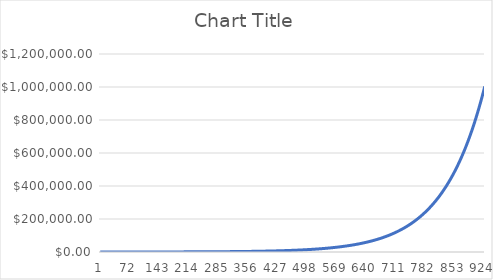
| Category | Series 0 |
|---|---|
| 0 | 101 |
| 1 | 102.01 |
| 2 | 103.03 |
| 3 | 104.06 |
| 4 | 105.101 |
| 5 | 106.152 |
| 6 | 107.214 |
| 7 | 108.286 |
| 8 | 109.369 |
| 9 | 110.462 |
| 10 | 111.567 |
| 11 | 112.683 |
| 12 | 113.809 |
| 13 | 114.947 |
| 14 | 116.097 |
| 15 | 117.258 |
| 16 | 118.43 |
| 17 | 119.615 |
| 18 | 120.811 |
| 19 | 122.019 |
| 20 | 123.239 |
| 21 | 124.472 |
| 22 | 125.716 |
| 23 | 126.973 |
| 24 | 128.243 |
| 25 | 129.526 |
| 26 | 130.821 |
| 27 | 132.129 |
| 28 | 133.45 |
| 29 | 134.785 |
| 30 | 136.133 |
| 31 | 137.494 |
| 32 | 138.869 |
| 33 | 140.258 |
| 34 | 141.66 |
| 35 | 143.077 |
| 36 | 144.508 |
| 37 | 145.953 |
| 38 | 147.412 |
| 39 | 148.886 |
| 40 | 150.375 |
| 41 | 151.879 |
| 42 | 153.398 |
| 43 | 154.932 |
| 44 | 156.481 |
| 45 | 158.046 |
| 46 | 159.626 |
| 47 | 161.223 |
| 48 | 162.835 |
| 49 | 164.463 |
| 50 | 166.108 |
| 51 | 167.769 |
| 52 | 169.447 |
| 53 | 171.141 |
| 54 | 172.852 |
| 55 | 174.581 |
| 56 | 176.327 |
| 57 | 178.09 |
| 58 | 179.871 |
| 59 | 181.67 |
| 60 | 183.486 |
| 61 | 185.321 |
| 62 | 187.174 |
| 63 | 189.046 |
| 64 | 190.937 |
| 65 | 192.846 |
| 66 | 194.774 |
| 67 | 196.722 |
| 68 | 198.689 |
| 69 | 200.676 |
| 70 | 202.683 |
| 71 | 204.71 |
| 72 | 206.757 |
| 73 | 208.825 |
| 74 | 210.913 |
| 75 | 213.022 |
| 76 | 215.152 |
| 77 | 217.304 |
| 78 | 219.477 |
| 79 | 221.672 |
| 80 | 223.888 |
| 81 | 226.127 |
| 82 | 228.388 |
| 83 | 230.672 |
| 84 | 232.979 |
| 85 | 235.309 |
| 86 | 237.662 |
| 87 | 240.038 |
| 88 | 242.439 |
| 89 | 244.863 |
| 90 | 247.312 |
| 91 | 249.785 |
| 92 | 252.283 |
| 93 | 254.806 |
| 94 | 257.354 |
| 95 | 259.927 |
| 96 | 262.527 |
| 97 | 265.152 |
| 98 | 267.803 |
| 99 | 270.481 |
| 100 | 273.186 |
| 101 | 275.918 |
| 102 | 278.677 |
| 103 | 281.464 |
| 104 | 284.279 |
| 105 | 287.121 |
| 106 | 289.993 |
| 107 | 292.893 |
| 108 | 295.822 |
| 109 | 298.78 |
| 110 | 301.768 |
| 111 | 304.785 |
| 112 | 307.833 |
| 113 | 310.911 |
| 114 | 314.02 |
| 115 | 317.161 |
| 116 | 320.332 |
| 117 | 323.536 |
| 118 | 326.771 |
| 119 | 330.039 |
| 120 | 333.339 |
| 121 | 336.672 |
| 122 | 340.039 |
| 123 | 343.44 |
| 124 | 346.874 |
| 125 | 350.343 |
| 126 | 353.846 |
| 127 | 357.385 |
| 128 | 360.958 |
| 129 | 364.568 |
| 130 | 368.214 |
| 131 | 371.896 |
| 132 | 375.615 |
| 133 | 379.371 |
| 134 | 383.165 |
| 135 | 386.996 |
| 136 | 390.866 |
| 137 | 394.775 |
| 138 | 398.723 |
| 139 | 402.71 |
| 140 | 406.737 |
| 141 | 410.804 |
| 142 | 414.912 |
| 143 | 419.062 |
| 144 | 423.252 |
| 145 | 427.485 |
| 146 | 431.76 |
| 147 | 436.077 |
| 148 | 440.438 |
| 149 | 444.842 |
| 150 | 449.291 |
| 151 | 453.784 |
| 152 | 458.321 |
| 153 | 462.905 |
| 154 | 467.534 |
| 155 | 472.209 |
| 156 | 476.931 |
| 157 | 481.7 |
| 158 | 486.517 |
| 159 | 491.383 |
| 160 | 496.296 |
| 161 | 501.259 |
| 162 | 506.272 |
| 163 | 511.335 |
| 164 | 516.448 |
| 165 | 521.613 |
| 166 | 526.829 |
| 167 | 532.097 |
| 168 | 537.418 |
| 169 | 542.792 |
| 170 | 548.22 |
| 171 | 553.702 |
| 172 | 559.239 |
| 173 | 564.832 |
| 174 | 570.48 |
| 175 | 576.185 |
| 176 | 581.947 |
| 177 | 587.766 |
| 178 | 593.644 |
| 179 | 599.58 |
| 180 | 605.576 |
| 181 | 611.632 |
| 182 | 617.748 |
| 183 | 623.926 |
| 184 | 630.165 |
| 185 | 636.466 |
| 186 | 642.831 |
| 187 | 649.259 |
| 188 | 655.752 |
| 189 | 662.31 |
| 190 | 668.933 |
| 191 | 675.622 |
| 192 | 682.378 |
| 193 | 689.202 |
| 194 | 696.094 |
| 195 | 703.055 |
| 196 | 710.085 |
| 197 | 717.186 |
| 198 | 724.358 |
| 199 | 731.602 |
| 200 | 738.918 |
| 201 | 746.307 |
| 202 | 753.77 |
| 203 | 761.308 |
| 204 | 768.921 |
| 205 | 776.61 |
| 206 | 784.376 |
| 207 | 792.22 |
| 208 | 800.142 |
| 209 | 808.144 |
| 210 | 816.225 |
| 211 | 824.387 |
| 212 | 832.631 |
| 213 | 840.957 |
| 214 | 849.367 |
| 215 | 857.861 |
| 216 | 866.439 |
| 217 | 875.104 |
| 218 | 883.855 |
| 219 | 892.693 |
| 220 | 901.62 |
| 221 | 910.636 |
| 222 | 919.743 |
| 223 | 928.94 |
| 224 | 938.23 |
| 225 | 947.612 |
| 226 | 957.088 |
| 227 | 966.659 |
| 228 | 976.325 |
| 229 | 986.089 |
| 230 | 995.95 |
| 231 | 1005.909 |
| 232 | 1015.968 |
| 233 | 1026.128 |
| 234 | 1036.389 |
| 235 | 1046.753 |
| 236 | 1057.221 |
| 237 | 1067.793 |
| 238 | 1078.471 |
| 239 | 1089.255 |
| 240 | 1100.148 |
| 241 | 1111.149 |
| 242 | 1122.261 |
| 243 | 1133.484 |
| 244 | 1144.818 |
| 245 | 1156.267 |
| 246 | 1167.829 |
| 247 | 1179.507 |
| 248 | 1191.303 |
| 249 | 1203.216 |
| 250 | 1215.248 |
| 251 | 1227.4 |
| 252 | 1239.674 |
| 253 | 1252.071 |
| 254 | 1264.592 |
| 255 | 1277.238 |
| 256 | 1290.01 |
| 257 | 1302.91 |
| 258 | 1315.939 |
| 259 | 1329.099 |
| 260 | 1342.39 |
| 261 | 1355.813 |
| 262 | 1369.372 |
| 263 | 1383.065 |
| 264 | 1396.896 |
| 265 | 1410.865 |
| 266 | 1424.974 |
| 267 | 1439.223 |
| 268 | 1453.616 |
| 269 | 1468.152 |
| 270 | 1482.833 |
| 271 | 1497.662 |
| 272 | 1512.638 |
| 273 | 1527.765 |
| 274 | 1543.042 |
| 275 | 1558.473 |
| 276 | 1574.057 |
| 277 | 1589.798 |
| 278 | 1605.696 |
| 279 | 1621.753 |
| 280 | 1637.97 |
| 281 | 1654.35 |
| 282 | 1670.894 |
| 283 | 1687.602 |
| 284 | 1704.479 |
| 285 | 1721.523 |
| 286 | 1738.739 |
| 287 | 1756.126 |
| 288 | 1773.687 |
| 289 | 1791.424 |
| 290 | 1809.338 |
| 291 | 1827.432 |
| 292 | 1845.706 |
| 293 | 1864.163 |
| 294 | 1882.805 |
| 295 | 1901.633 |
| 296 | 1920.649 |
| 297 | 1939.856 |
| 298 | 1959.254 |
| 299 | 1978.847 |
| 300 | 1998.635 |
| 301 | 2018.621 |
| 302 | 2038.808 |
| 303 | 2059.196 |
| 304 | 2079.788 |
| 305 | 2100.586 |
| 306 | 2121.591 |
| 307 | 2142.807 |
| 308 | 2164.235 |
| 309 | 2185.878 |
| 310 | 2207.737 |
| 311 | 2229.814 |
| 312 | 2252.112 |
| 313 | 2274.633 |
| 314 | 2297.38 |
| 315 | 2320.353 |
| 316 | 2343.557 |
| 317 | 2366.992 |
| 318 | 2390.662 |
| 319 | 2414.569 |
| 320 | 2438.715 |
| 321 | 2463.102 |
| 322 | 2487.733 |
| 323 | 2512.61 |
| 324 | 2537.736 |
| 325 | 2563.114 |
| 326 | 2588.745 |
| 327 | 2614.632 |
| 328 | 2640.778 |
| 329 | 2667.186 |
| 330 | 2693.858 |
| 331 | 2720.797 |
| 332 | 2748.005 |
| 333 | 2775.485 |
| 334 | 2803.24 |
| 335 | 2831.272 |
| 336 | 2859.585 |
| 337 | 2888.181 |
| 338 | 2917.062 |
| 339 | 2946.233 |
| 340 | 2975.695 |
| 341 | 3005.452 |
| 342 | 3035.507 |
| 343 | 3065.862 |
| 344 | 3096.52 |
| 345 | 3127.486 |
| 346 | 3158.761 |
| 347 | 3190.348 |
| 348 | 3222.252 |
| 349 | 3254.474 |
| 350 | 3287.019 |
| 351 | 3319.889 |
| 352 | 3353.088 |
| 353 | 3386.619 |
| 354 | 3420.485 |
| 355 | 3454.69 |
| 356 | 3489.237 |
| 357 | 3524.129 |
| 358 | 3559.37 |
| 359 | 3594.964 |
| 360 | 3630.914 |
| 361 | 3667.223 |
| 362 | 3703.895 |
| 363 | 3740.934 |
| 364 | 3778.343 |
| 365 | 3816.127 |
| 366 | 3854.288 |
| 367 | 3892.831 |
| 368 | 3931.759 |
| 369 | 3971.077 |
| 370 | 4010.788 |
| 371 | 4050.896 |
| 372 | 4091.405 |
| 373 | 4132.319 |
| 374 | 4173.642 |
| 375 | 4215.378 |
| 376 | 4257.532 |
| 377 | 4300.107 |
| 378 | 4343.108 |
| 379 | 4386.539 |
| 380 | 4430.405 |
| 381 | 4474.709 |
| 382 | 4519.456 |
| 383 | 4564.651 |
| 384 | 4610.297 |
| 385 | 4656.4 |
| 386 | 4702.964 |
| 387 | 4749.994 |
| 388 | 4797.494 |
| 389 | 4845.469 |
| 390 | 4893.923 |
| 391 | 4942.862 |
| 392 | 4992.291 |
| 393 | 5042.214 |
| 394 | 5092.636 |
| 395 | 5143.562 |
| 396 | 5194.998 |
| 397 | 5246.948 |
| 398 | 5299.418 |
| 399 | 5352.412 |
| 400 | 5405.936 |
| 401 | 5459.995 |
| 402 | 5514.595 |
| 403 | 5569.741 |
| 404 | 5625.439 |
| 405 | 5681.693 |
| 406 | 5738.51 |
| 407 | 5795.895 |
| 408 | 5853.854 |
| 409 | 5912.392 |
| 410 | 5971.516 |
| 411 | 6031.231 |
| 412 | 6091.544 |
| 413 | 6152.459 |
| 414 | 6213.984 |
| 415 | 6276.124 |
| 416 | 6338.885 |
| 417 | 6402.274 |
| 418 | 6466.297 |
| 419 | 6530.959 |
| 420 | 6596.269 |
| 421 | 6662.232 |
| 422 | 6728.854 |
| 423 | 6796.143 |
| 424 | 6864.104 |
| 425 | 6932.745 |
| 426 | 7002.073 |
| 427 | 7072.093 |
| 428 | 7142.814 |
| 429 | 7214.242 |
| 430 | 7286.385 |
| 431 | 7359.249 |
| 432 | 7432.841 |
| 433 | 7507.17 |
| 434 | 7582.241 |
| 435 | 7658.064 |
| 436 | 7734.644 |
| 437 | 7811.991 |
| 438 | 7890.111 |
| 439 | 7969.012 |
| 440 | 8048.702 |
| 441 | 8129.189 |
| 442 | 8210.481 |
| 443 | 8292.586 |
| 444 | 8375.511 |
| 445 | 8459.266 |
| 446 | 8543.859 |
| 447 | 8629.298 |
| 448 | 8715.591 |
| 449 | 8802.747 |
| 450 | 8890.774 |
| 451 | 8979.682 |
| 452 | 9069.479 |
| 453 | 9160.173 |
| 454 | 9251.775 |
| 455 | 9344.293 |
| 456 | 9437.736 |
| 457 | 9532.113 |
| 458 | 9627.434 |
| 459 | 9723.709 |
| 460 | 9820.946 |
| 461 | 9919.155 |
| 462 | 10018.347 |
| 463 | 10118.53 |
| 464 | 10219.716 |
| 465 | 10321.913 |
| 466 | 10425.132 |
| 467 | 10529.383 |
| 468 | 10634.677 |
| 469 | 10741.024 |
| 470 | 10848.434 |
| 471 | 10956.918 |
| 472 | 11066.488 |
| 473 | 11177.152 |
| 474 | 11288.924 |
| 475 | 11401.813 |
| 476 | 11515.831 |
| 477 | 11630.99 |
| 478 | 11747.3 |
| 479 | 11864.773 |
| 480 | 11983.42 |
| 481 | 12103.254 |
| 482 | 12224.287 |
| 483 | 12346.53 |
| 484 | 12469.995 |
| 485 | 12594.695 |
| 486 | 12720.642 |
| 487 | 12847.848 |
| 488 | 12976.327 |
| 489 | 13106.09 |
| 490 | 13237.151 |
| 491 | 13369.523 |
| 492 | 13503.218 |
| 493 | 13638.25 |
| 494 | 13774.633 |
| 495 | 13912.379 |
| 496 | 14051.503 |
| 497 | 14192.018 |
| 498 | 14333.938 |
| 499 | 14477.277 |
| 500 | 14622.05 |
| 501 | 14768.271 |
| 502 | 14915.953 |
| 503 | 15065.113 |
| 504 | 15215.764 |
| 505 | 15367.922 |
| 506 | 15521.601 |
| 507 | 15676.817 |
| 508 | 15833.585 |
| 509 | 15991.921 |
| 510 | 16151.84 |
| 511 | 16313.358 |
| 512 | 16476.492 |
| 513 | 16641.257 |
| 514 | 16807.669 |
| 515 | 16975.746 |
| 516 | 17145.504 |
| 517 | 17316.959 |
| 518 | 17490.128 |
| 519 | 17665.029 |
| 520 | 17841.68 |
| 521 | 18020.097 |
| 522 | 18200.298 |
| 523 | 18382.301 |
| 524 | 18566.124 |
| 525 | 18751.785 |
| 526 | 18939.303 |
| 527 | 19128.696 |
| 528 | 19319.983 |
| 529 | 19513.182 |
| 530 | 19708.314 |
| 531 | 19905.397 |
| 532 | 20104.451 |
| 533 | 20305.496 |
| 534 | 20508.551 |
| 535 | 20713.636 |
| 536 | 20920.773 |
| 537 | 21129.98 |
| 538 | 21341.28 |
| 539 | 21554.693 |
| 540 | 21770.24 |
| 541 | 21987.942 |
| 542 | 22207.822 |
| 543 | 22429.9 |
| 544 | 22654.199 |
| 545 | 22880.741 |
| 546 | 23109.548 |
| 547 | 23340.644 |
| 548 | 23574.05 |
| 549 | 23809.791 |
| 550 | 24047.889 |
| 551 | 24288.368 |
| 552 | 24531.251 |
| 553 | 24776.564 |
| 554 | 25024.329 |
| 555 | 25274.573 |
| 556 | 25527.318 |
| 557 | 25782.592 |
| 558 | 26040.418 |
| 559 | 26300.822 |
| 560 | 26563.83 |
| 561 | 26829.468 |
| 562 | 27097.763 |
| 563 | 27368.741 |
| 564 | 27642.428 |
| 565 | 27918.852 |
| 566 | 28198.041 |
| 567 | 28480.021 |
| 568 | 28764.821 |
| 569 | 29052.47 |
| 570 | 29342.994 |
| 571 | 29636.424 |
| 572 | 29932.789 |
| 573 | 30232.116 |
| 574 | 30534.438 |
| 575 | 30839.782 |
| 576 | 31148.18 |
| 577 | 31459.662 |
| 578 | 31774.258 |
| 579 | 32092.001 |
| 580 | 32412.921 |
| 581 | 32737.05 |
| 582 | 33064.42 |
| 583 | 33395.065 |
| 584 | 33729.015 |
| 585 | 34066.305 |
| 586 | 34406.969 |
| 587 | 34751.038 |
| 588 | 35098.549 |
| 589 | 35449.534 |
| 590 | 35804.029 |
| 591 | 36162.07 |
| 592 | 36523.69 |
| 593 | 36888.927 |
| 594 | 37257.817 |
| 595 | 37630.395 |
| 596 | 38006.699 |
| 597 | 38386.766 |
| 598 | 38770.633 |
| 599 | 39158.34 |
| 600 | 39549.923 |
| 601 | 39945.422 |
| 602 | 40344.877 |
| 603 | 40748.325 |
| 604 | 41155.809 |
| 605 | 41567.367 |
| 606 | 41983.04 |
| 607 | 42402.871 |
| 608 | 42826.899 |
| 609 | 43255.168 |
| 610 | 43687.72 |
| 611 | 44124.597 |
| 612 | 44565.843 |
| 613 | 45011.502 |
| 614 | 45461.617 |
| 615 | 45916.233 |
| 616 | 46375.395 |
| 617 | 46839.149 |
| 618 | 47307.541 |
| 619 | 47780.616 |
| 620 | 48258.422 |
| 621 | 48741.006 |
| 622 | 49228.417 |
| 623 | 49720.701 |
| 624 | 50217.908 |
| 625 | 50720.087 |
| 626 | 51227.288 |
| 627 | 51739.561 |
| 628 | 52256.956 |
| 629 | 52779.526 |
| 630 | 53307.321 |
| 631 | 53840.394 |
| 632 | 54378.798 |
| 633 | 54922.586 |
| 634 | 55471.812 |
| 635 | 56026.53 |
| 636 | 56586.795 |
| 637 | 57152.663 |
| 638 | 57724.19 |
| 639 | 58301.432 |
| 640 | 58884.446 |
| 641 | 59473.291 |
| 642 | 60068.024 |
| 643 | 60668.704 |
| 644 | 61275.391 |
| 645 | 61888.145 |
| 646 | 62507.026 |
| 647 | 63132.096 |
| 648 | 63763.417 |
| 649 | 64401.052 |
| 650 | 65045.062 |
| 651 | 65695.513 |
| 652 | 66352.468 |
| 653 | 67015.993 |
| 654 | 67686.152 |
| 655 | 68363.014 |
| 656 | 69046.644 |
| 657 | 69737.111 |
| 658 | 70434.482 |
| 659 | 71138.826 |
| 660 | 71850.215 |
| 661 | 72568.717 |
| 662 | 73294.404 |
| 663 | 74027.348 |
| 664 | 74767.622 |
| 665 | 75515.298 |
| 666 | 76270.451 |
| 667 | 77033.155 |
| 668 | 77803.487 |
| 669 | 78581.522 |
| 670 | 79367.337 |
| 671 | 80161.01 |
| 672 | 80962.62 |
| 673 | 81772.247 |
| 674 | 82589.969 |
| 675 | 83415.869 |
| 676 | 84250.027 |
| 677 | 85092.528 |
| 678 | 85943.453 |
| 679 | 86802.887 |
| 680 | 87670.916 |
| 681 | 88547.626 |
| 682 | 89433.102 |
| 683 | 90327.433 |
| 684 | 91230.707 |
| 685 | 92143.014 |
| 686 | 93064.444 |
| 687 | 93995.089 |
| 688 | 94935.04 |
| 689 | 95884.39 |
| 690 | 96843.234 |
| 691 | 97811.666 |
| 692 | 98789.783 |
| 693 | 99777.681 |
| 694 | 100775.458 |
| 695 | 101783.212 |
| 696 | 102801.044 |
| 697 | 103829.055 |
| 698 | 104867.345 |
| 699 | 105916.019 |
| 700 | 106975.179 |
| 701 | 108044.931 |
| 702 | 109125.38 |
| 703 | 110216.634 |
| 704 | 111318.8 |
| 705 | 112431.988 |
| 706 | 113556.308 |
| 707 | 114691.871 |
| 708 | 115838.79 |
| 709 | 116997.178 |
| 710 | 118167.15 |
| 711 | 119348.821 |
| 712 | 120542.309 |
| 713 | 121747.732 |
| 714 | 122965.21 |
| 715 | 124194.862 |
| 716 | 125436.81 |
| 717 | 126691.178 |
| 718 | 127958.09 |
| 719 | 129237.671 |
| 720 | 130530.048 |
| 721 | 131835.348 |
| 722 | 133153.702 |
| 723 | 134485.239 |
| 724 | 135830.091 |
| 725 | 137188.392 |
| 726 | 138560.276 |
| 727 | 139945.879 |
| 728 | 141345.338 |
| 729 | 142758.791 |
| 730 | 144186.379 |
| 731 | 145628.243 |
| 732 | 147084.525 |
| 733 | 148555.37 |
| 734 | 150040.924 |
| 735 | 151541.333 |
| 736 | 153056.747 |
| 737 | 154587.314 |
| 738 | 156133.187 |
| 739 | 157694.519 |
| 740 | 159271.464 |
| 741 | 160864.179 |
| 742 | 162472.821 |
| 743 | 164097.549 |
| 744 | 165738.524 |
| 745 | 167395.91 |
| 746 | 169069.869 |
| 747 | 170760.567 |
| 748 | 172468.173 |
| 749 | 174192.855 |
| 750 | 175934.783 |
| 751 | 177694.131 |
| 752 | 179471.073 |
| 753 | 181265.783 |
| 754 | 183078.441 |
| 755 | 184909.226 |
| 756 | 186758.318 |
| 757 | 188625.901 |
| 758 | 190512.16 |
| 759 | 192417.282 |
| 760 | 194341.454 |
| 761 | 196284.869 |
| 762 | 198247.718 |
| 763 | 200230.195 |
| 764 | 202232.497 |
| 765 | 204254.822 |
| 766 | 206297.37 |
| 767 | 208360.344 |
| 768 | 210443.947 |
| 769 | 212548.387 |
| 770 | 214673.87 |
| 771 | 216820.609 |
| 772 | 218988.815 |
| 773 | 221178.703 |
| 774 | 223390.49 |
| 775 | 225624.395 |
| 776 | 227880.639 |
| 777 | 230159.446 |
| 778 | 232461.04 |
| 779 | 234785.651 |
| 780 | 237133.507 |
| 781 | 239504.842 |
| 782 | 241899.891 |
| 783 | 244318.889 |
| 784 | 246762.078 |
| 785 | 249229.699 |
| 786 | 251721.996 |
| 787 | 254239.216 |
| 788 | 256781.608 |
| 789 | 259349.424 |
| 790 | 261942.919 |
| 791 | 264562.348 |
| 792 | 267207.971 |
| 793 | 269880.051 |
| 794 | 272578.851 |
| 795 | 275304.64 |
| 796 | 278057.686 |
| 797 | 280838.263 |
| 798 | 283646.646 |
| 799 | 286483.112 |
| 800 | 289347.943 |
| 801 | 292241.423 |
| 802 | 295163.837 |
| 803 | 298115.475 |
| 804 | 301096.63 |
| 805 | 304107.597 |
| 806 | 307148.672 |
| 807 | 310220.159 |
| 808 | 313322.361 |
| 809 | 316455.584 |
| 810 | 319620.14 |
| 811 | 322816.342 |
| 812 | 326044.505 |
| 813 | 329304.95 |
| 814 | 332598 |
| 815 | 335923.98 |
| 816 | 339283.219 |
| 817 | 342676.052 |
| 818 | 346102.812 |
| 819 | 349563.84 |
| 820 | 353059.479 |
| 821 | 356590.073 |
| 822 | 360155.974 |
| 823 | 363757.534 |
| 824 | 367395.109 |
| 825 | 371069.06 |
| 826 | 374779.751 |
| 827 | 378527.548 |
| 828 | 382312.824 |
| 829 | 386135.952 |
| 830 | 389997.312 |
| 831 | 393897.285 |
| 832 | 397836.258 |
| 833 | 401814.62 |
| 834 | 405832.766 |
| 835 | 409891.094 |
| 836 | 413990.005 |
| 837 | 418129.905 |
| 838 | 422311.204 |
| 839 | 426534.316 |
| 840 | 430799.659 |
| 841 | 435107.656 |
| 842 | 439458.732 |
| 843 | 443853.32 |
| 844 | 448291.853 |
| 845 | 452774.772 |
| 846 | 457302.519 |
| 847 | 461875.544 |
| 848 | 466494.3 |
| 849 | 471159.243 |
| 850 | 475870.835 |
| 851 | 480629.544 |
| 852 | 485435.839 |
| 853 | 490290.198 |
| 854 | 495193.099 |
| 855 | 500145.03 |
| 856 | 505146.481 |
| 857 | 510197.946 |
| 858 | 515299.925 |
| 859 | 520452.924 |
| 860 | 525657.454 |
| 861 | 530914.028 |
| 862 | 536223.168 |
| 863 | 541585.4 |
| 864 | 547001.254 |
| 865 | 552471.267 |
| 866 | 557995.979 |
| 867 | 563575.939 |
| 868 | 569211.698 |
| 869 | 574903.815 |
| 870 | 580652.854 |
| 871 | 586459.382 |
| 872 | 592323.976 |
| 873 | 598247.216 |
| 874 | 604229.688 |
| 875 | 610271.985 |
| 876 | 616374.705 |
| 877 | 622538.452 |
| 878 | 628763.836 |
| 879 | 635051.474 |
| 880 | 641401.989 |
| 881 | 647816.009 |
| 882 | 654294.169 |
| 883 | 660837.111 |
| 884 | 667445.482 |
| 885 | 674119.937 |
| 886 | 680861.136 |
| 887 | 687669.748 |
| 888 | 694546.445 |
| 889 | 701491.909 |
| 890 | 708506.829 |
| 891 | 715591.897 |
| 892 | 722747.816 |
| 893 | 729975.294 |
| 894 | 737275.047 |
| 895 | 744647.797 |
| 896 | 752094.275 |
| 897 | 759615.218 |
| 898 | 767211.37 |
| 899 | 774883.484 |
| 900 | 782632.319 |
| 901 | 790458.642 |
| 902 | 798363.228 |
| 903 | 806346.861 |
| 904 | 814410.329 |
| 905 | 822554.433 |
| 906 | 830779.977 |
| 907 | 839087.777 |
| 908 | 847478.655 |
| 909 | 855953.441 |
| 910 | 864512.975 |
| 911 | 873158.105 |
| 912 | 881889.686 |
| 913 | 890708.583 |
| 914 | 899615.669 |
| 915 | 908611.826 |
| 916 | 917697.944 |
| 917 | 926874.923 |
| 918 | 936143.673 |
| 919 | 945505.109 |
| 920 | 954960.16 |
| 921 | 964509.762 |
| 922 | 974154.86 |
| 923 | 983896.408 |
| 924 | 993735.372 |
| 925 | 1003672.726 |